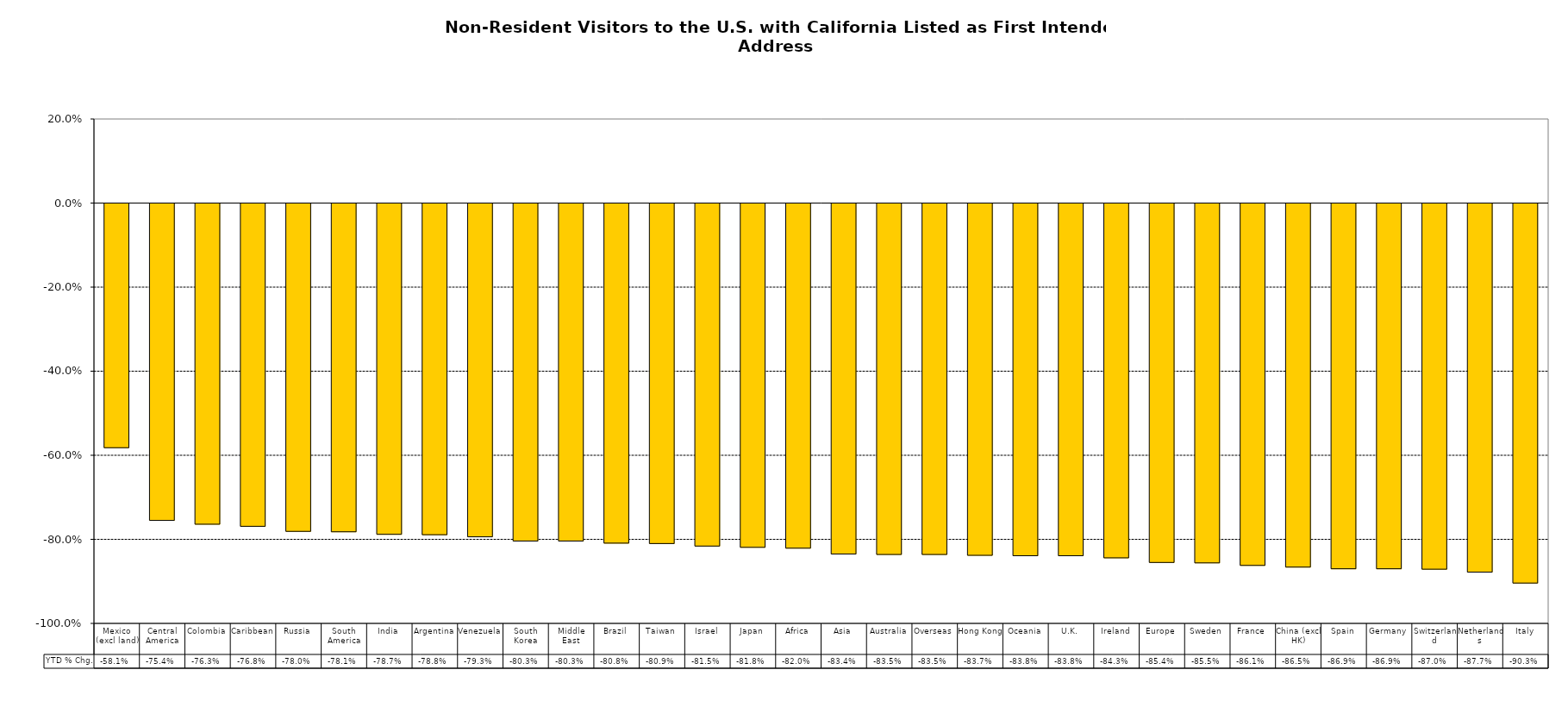
| Category | YTD % Chg. |
|---|---|
| Mexico (excl land) | -0.581 |
| Central America | -0.754 |
| Colombia | -0.763 |
| Caribbean | -0.768 |
| Russia | -0.78 |
| South America | -0.781 |
| India | -0.787 |
| Argentina | -0.788 |
| Venezuela | -0.793 |
| South Korea | -0.803 |
| Middle East | -0.803 |
| Brazil | -0.808 |
| Taiwan | -0.809 |
| Israel | -0.815 |
| Japan | -0.818 |
| Africa | -0.82 |
| Asia | -0.834 |
| Australia | -0.835 |
| Overseas | -0.835 |
| Hong Kong | -0.837 |
| Oceania | -0.838 |
| U.K. | -0.838 |
| Ireland | -0.843 |
| Europe | -0.854 |
| Sweden | -0.855 |
| France | -0.861 |
| China (excl HK) | -0.865 |
| Spain | -0.869 |
| Germany | -0.869 |
| Switzerland | -0.87 |
| Netherlands | -0.877 |
| Italy | -0.903 |